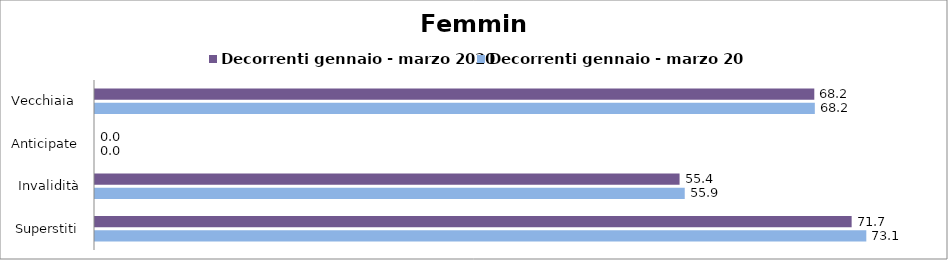
| Category | Decorrenti gennaio - marzo 2020 | Decorrenti gennaio - marzo 2021 |
|---|---|---|
| Vecchiaia  | 68.18 | 68.23 |
| Anticipate | 0 | 0 |
| Invalidità | 55.41 | 55.9 |
| Superstiti | 71.72 | 73.11 |